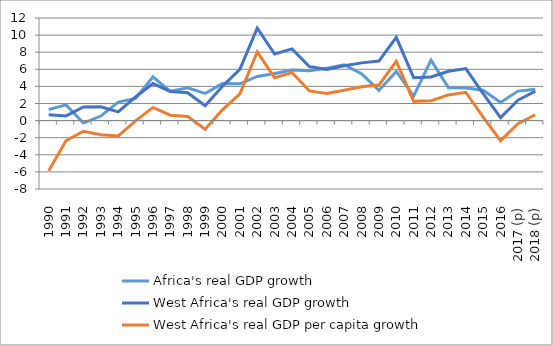
| Category | Africa's real GDP growth | West Africa's real GDP growth | West Africa's real GDP per capita growth |
|---|---|---|---|
| 1990 | 1.3 | 0.695 | -5.856 |
| 1991 | 1.843 | 0.551 | -2.336 |
| 1992 | -0.285 | 1.587 | -1.251 |
| 1993 | 0.532 | 1.616 | -1.659 |
| 1994 | 2.169 | 1.014 | -1.794 |
| 1995 | 2.599 | 2.765 | -0.033 |
| 1996 | 5.106 | 4.331 | 1.54 |
| 1997 | 3.429 | 3.413 | 0.631 |
| 1998 | 3.842 | 3.254 | 0.483 |
| 1999 | 3.172 | 1.747 | -1.005 |
| 2000 | 4.325 | 4.018 | 1.266 |
| 2001 | 4.307 | 5.991 | 3.135 |
| 2002 | 5.163 | 10.812 | 8.041 |
| 2003 | 5.513 | 7.784 | 5.024 |
| 2004 | 5.916 | 8.383 | 5.617 |
| 2005 | 5.842 | 6.317 | 3.478 |
| 2006 | 6.124 | 5.986 | 3.179 |
| 2007 | 6.535 | 6.418 | 3.549 |
| 2008 | 5.489 | 6.752 | 3.965 |
| 2009 | 3.53 | 6.968 | 4.15 |
| 2010 | 5.758 | 9.737 | 6.95 |
| 2011 | 2.872 | 5.017 | 2.249 |
| 2012 | 7.065 | 5.096 | 2.33 |
| 2013 | 3.854 | 5.766 | 3.006 |
| 2014 | 3.819 | 6.085 | 3.315 |
| 2015 | 3.545 | 3.167 | 0.416 |
| 2016 | 2.125 | 0.35 | -2.344 |
| 2017 (p) | 3.452 | 2.391 | -0.357 |
| 2018 (p) | 3.668 | 3.432 | 0.688 |